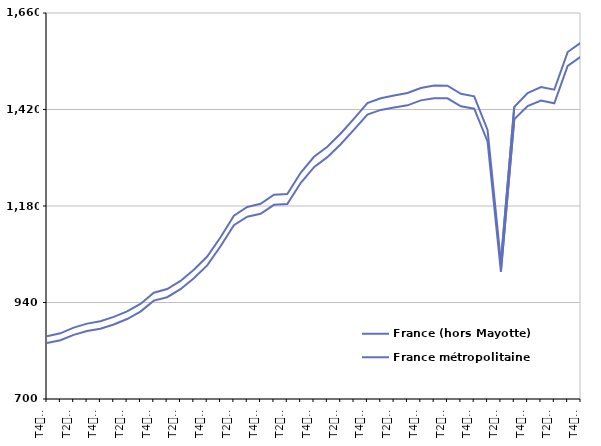
| Category | France (hors Mayotte) | France métropolitaine |
|---|---|---|
| T4
2011 | 855.9 | 839.1 |
| T1
2012 | 863.4 | 846 |
| T2
2012 | 877.5 | 859.5 |
| T3
2012 | 887.5 | 869 |
| T4
2012 | 893.6 | 874.9 |
| T1
2013 | 904.1 | 885.3 |
| T2
2013 | 918 | 898.9 |
| T3
2013 | 936.5 | 917.3 |
| T4
2013 | 964.2 | 944.7 |
| T1
2014 | 973.4 | 953.1 |
| T2
2014 | 993.6 | 973 |
| T3
2014 | 1021.3 | 1000.1 |
| T4
2014 | 1054.3 | 1032.3 |
| T1
2015 | 1102.2 | 1079.8 |
| T2
2015 | 1155.9 | 1132.3 |
| T3
2015 | 1177.6 | 1153.3 |
| T4
2015 | 1185.4 | 1160.5 |
| T1
2016 | 1208 | 1182.9 |
| T2
2016 | 1209.8 | 1184.9 |
| T3
2016 | 1262.6 | 1237.1 |
| T4
2016 | 1302.4 | 1276.7 |
| T1
2017 | 1327.4 | 1301.5 |
| T2
2017 | 1360.4 | 1333.7 |
| T3
2017 | 1397.4 | 1369.8 |
| T4
2017 | 1436 | 1407.6 |
| T1
2018 | 1447.8 | 1419 |
| T2
2018 | 1454.9 | 1424.9 |
| T3
2018 | 1460.9 | 1430.4 |
| T4
2018 | 1473.4 | 1442.7 |
| T1
2019 | 1479.7 | 1447.8 |
| T2
2019 | 1479.3 | 1447.9 |
| T3
2019 | 1459 | 1428 |
| T4
2019 | 1452.9 | 1422.1 |
| T1
2020 | 1369.3 | 1340.5 |
| T2
2020 | 1040.4 | 1016.7 |
| T3
2020 | 1426.2 | 1395.7 |
| T4
2020 | 1461 | 1428.6 |
| T1
2021 | 1475.9 | 1442.5 |
| T2
2021 | 1469.2 | 1435.5 |
| T3
2021 | 1562.9 | 1528.6 |
| T4
2021 | 1586.4 | 1551.5 |